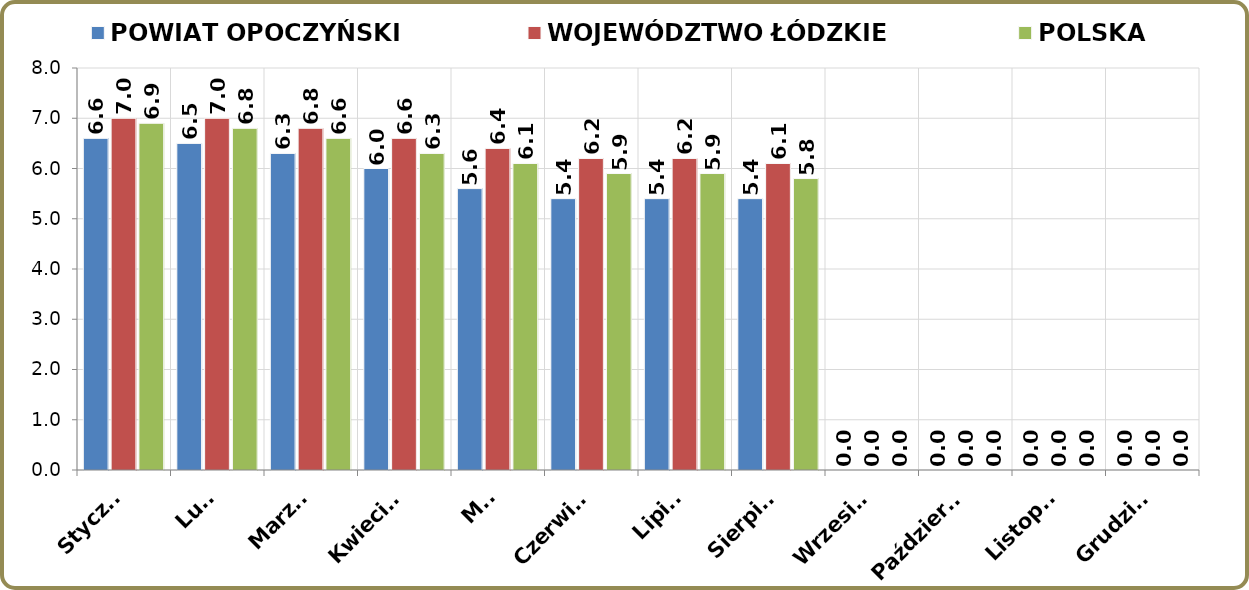
| Category | POWIAT OPOCZYŃSKI | WOJEWÓDZTWO ŁÓDZKIE | POLSKA |
|---|---|---|---|
| Styczeń | 6.6 | 7 | 6.9 |
| Luty | 6.5 | 7 | 6.8 |
| Marzec | 6.3 | 6.8 | 6.6 |
| Kwiecień | 6 | 6.6 | 6.3 |
| Maj | 5.6 | 6.4 | 6.1 |
| Czerwiec | 5.4 | 6.2 | 5.9 |
| Lipiec | 5.4 | 6.2 | 5.9 |
| Sierpień | 5.4 | 6.1 | 5.8 |
| Wrzesień | 0 | 0 | 0 |
| Październik | 0 | 0 | 0 |
| Listopad | 0 | 0 | 0 |
| Grudzień | 0 | 0 | 0 |